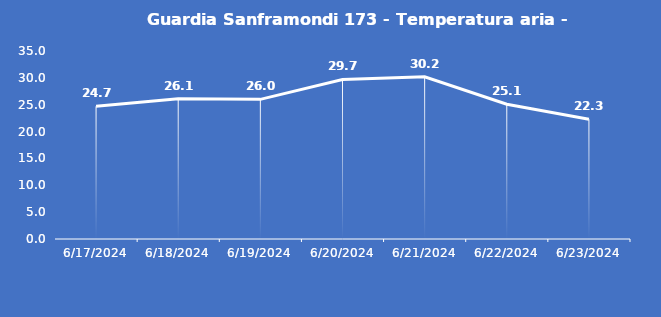
| Category | Guardia Sanframondi 173 - Temperatura aria - Grezzo (°C) |
|---|---|
| 6/17/24 | 24.7 |
| 6/18/24 | 26.1 |
| 6/19/24 | 26 |
| 6/20/24 | 29.7 |
| 6/21/24 | 30.2 |
| 6/22/24 | 25.1 |
| 6/23/24 | 22.3 |